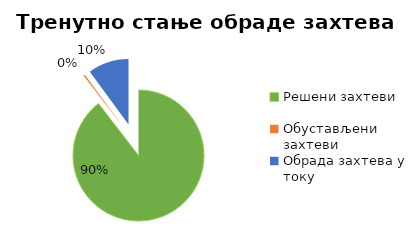
| Category | Series 0 |
|---|---|
| Решени захтеви | 30864 |
| Обустављени захтеви | 136 |
| Обрада захтева у току | 3466 |